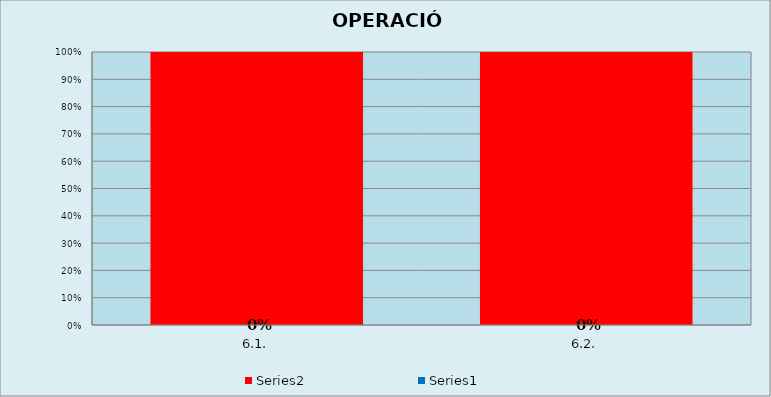
| Category | Series 0 | Series 1 |
|---|---|---|
| 6.1. | 0 | 1 |
| 6.2. | 0 | 1 |